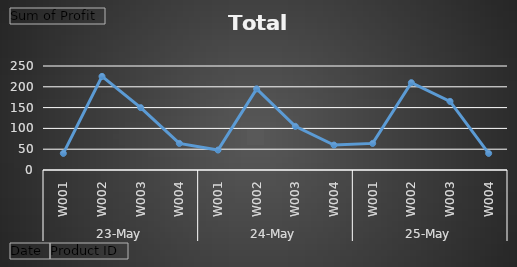
| Category | Total |
|---|---|
| 0 | 40 |
| 1 | 225 |
| 2 | 150 |
| 3 | 64 |
| 4 | 48 |
| 5 | 195 |
| 6 | 105 |
| 7 | 60 |
| 8 | 64 |
| 9 | 210 |
| 10 | 165 |
| 11 | 40 |